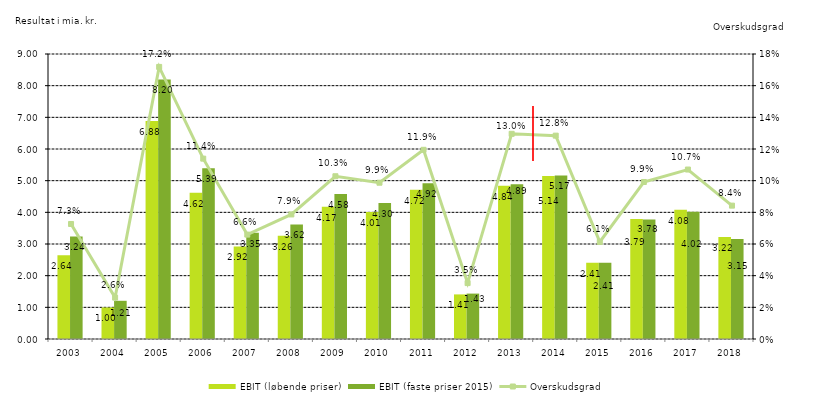
| Category | EBIT (løbende priser) | EBIT (faste priser 2015) |
|---|---|---|
| 2003.0 | 2.643 | 3.239 |
| 2004.0 | 0.995 | 1.206 |
| 2005.0 | 6.885 | 8.196 |
| 2006.0 | 4.616 | 5.393 |
| 2007.0 | 2.922 | 3.355 |
| 2008.0 | 3.26 | 3.618 |
| 2009.0 | 4.174 | 4.576 |
| 2010.0 | 4.007 | 4.295 |
| 2011.0 | 4.716 | 4.917 |
| 2012.0 | 1.408 | 1.434 |
| 2013.0 | 4.838 | 4.886 |
| 2014.0 | 5.145 | 5.165 |
| 2015.0 | 2.41 | 2.41 |
| 2016.0 | 3.787 | 3.775 |
| 2017.0 | 4.078 | 4.022 |
| 2018.0 | 3.224 | 3.154 |